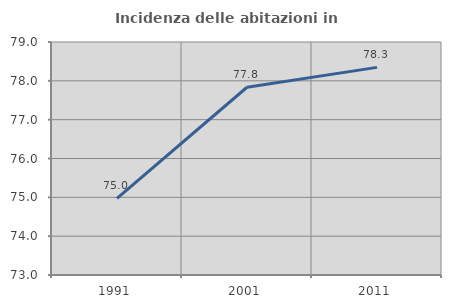
| Category | Incidenza delle abitazioni in proprietà  |
|---|---|
| 1991.0 | 74.973 |
| 2001.0 | 77.835 |
| 2011.0 | 78.347 |